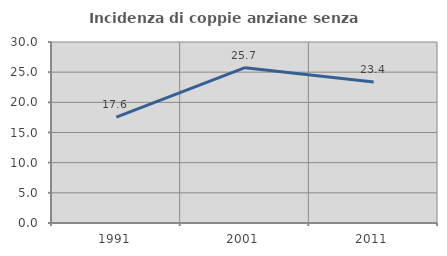
| Category | Incidenza di coppie anziane senza figli  |
|---|---|
| 1991.0 | 17.55 |
| 2001.0 | 25.749 |
| 2011.0 | 23.377 |